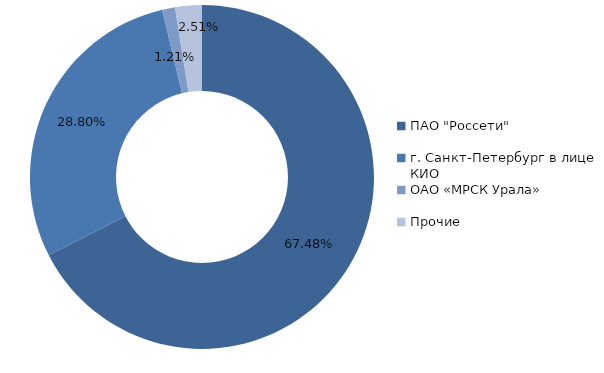
| Category | Series 0 |
|---|---|
| ПАО "Россети" | 67.48 |
| г. Санкт-Петербург в лице КИО | 28.8 |
| ОАО «МРСК Урала» | 1.21 |
| Прочие | 2.51 |